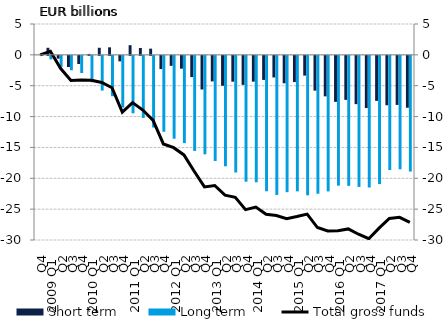
| Category | Short term | Long term  |
|---|---|---|
| Q4 | 0 | 0 |
| 2009 Q1 | 1.146 | -0.569 |
| Q2 | -0.45 | -1.774 |
| Q3 | -1.812 | -2.335 |
| Q4 | -1.32 | -2.774 |
| 2010 Q1 | 0.151 | -4.276 |
| Q2 | 1.149 | -5.624 |
| Q3 | 1.219 | -6.544 |
| Q4 | -0.89 | -8.382 |
| 2011 Q1 | 1.566 | -9.306 |
| Q2 | 1.117 | -10.062 |
| Q3 | 1.005 | -11.613 |
| Q4 | -2.141 | -12.295 |
| 2012 Q1 | -1.618 | -13.424 |
| Q2 | -2.075 | -14.139 |
| Q3 | -3.443 | -15.407 |
| Q4 | -5.45 | -15.951 |
| 2013 Q1 | -4.137 | -17.035 |
| Q2 | -4.847 | -17.895 |
| Q3 | -4.192 | -18.901 |
| Q4 | -4.699 | -20.387 |
| 2014 Q1 | -4.182 | -20.484 |
| Q2 | -3.898 | -21.94 |
| Q3 | -3.502 | -22.537 |
| Q4 | -4.443 | -22.089 |
| 2015 Q1 | -4.243 | -21.956 |
| Q2 | -3.2 | -22.6 |
| Q3 | -5.638 | -22.343 |
| Q4 | -6.561 | -21.966 |
| 2016 Q1 | -7.452 | -21.031 |
| Q2 | -7.132 | -21.07 |
| Q3 | -7.825 | -21.238 |
| Q4 | -8.457 | -21.33 |
| 2017 Q1 | -7.289 | -20.783 |
| Q2 | -8.002 | -18.505 |
| Q3 | -7.951 | -18.377 |
| Q4 | -8.407 | -18.747 |